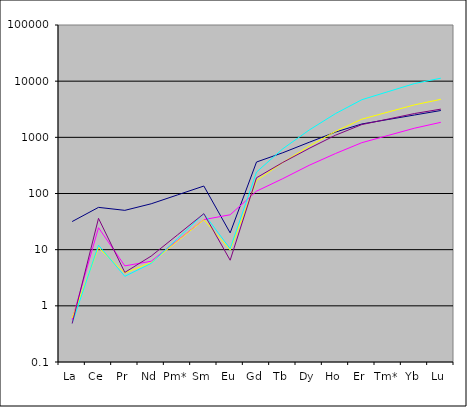
| Category | Series 0 | Series 1 | Series 2 | Series 3 | Series 4 |
|---|---|---|---|---|---|
| La | 31.687 | 0.568 | 0.606 | 0.489 | 0.484 |
| Ce | 56.641 | 24.604 | 10.839 | 12.033 | 36.16 |
| Pr | 50.1 | 5.145 | 3.848 | 3.349 | 3.936 |
| Nd | 65.585 | 6.218 | 5.881 | 5.713 | 7.686 |
| Pm* | 94.371 | 14.598 | 14.171 | 15.788 | 18.338 |
| Sm | 135.793 | 34.268 | 34.147 | 43.629 | 43.75 |
| Eu | 19.899 | 41.816 | 9.862 | 10.409 | 6.489 |
| Gd | 363.525 | 109.884 | 169.745 | 240.882 | 190.534 |
| Tb | 531.922 | 183.894 | 357.737 | 626.202 | 357.746 |
| Dy | 815.917 | 317.782 | 695.952 | 1347.697 | 635.183 |
| Ho | 1239.991 | 514.776 | 1276.106 | 2644.856 | 1091.759 |
| Er | 1730.66 | 803.159 | 2103.367 | 4676.294 | 1687.982 |
| Tm* | 2079.03 | 1080.846 | 2822.333 | 6511.2 | 2116.25 |
| Yb | 2497.524 | 1454.543 | 3787.053 | 9066.093 | 2653.175 |
| Lu | 3003.391 | 1850.142 | 4751.049 | 11294.34 | 3174.814 |